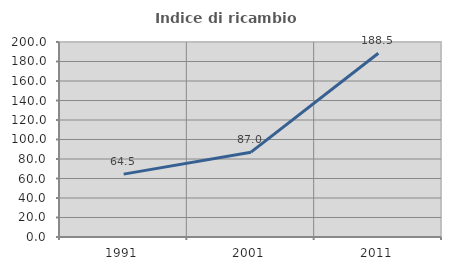
| Category | Indice di ricambio occupazionale  |
|---|---|
| 1991.0 | 64.501 |
| 2001.0 | 86.99 |
| 2011.0 | 188.489 |